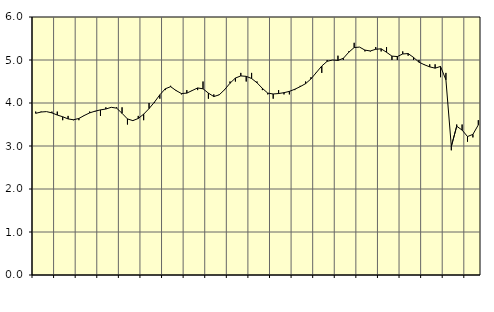
| Category | Piggar | Series 1 |
|---|---|---|
| nan | 3.8 | 3.76 |
| 1.0 | 3.8 | 3.79 |
| 1.0 | 3.8 | 3.8 |
| 1.0 | 3.8 | 3.77 |
| nan | 3.8 | 3.72 |
| 2.0 | 3.6 | 3.68 |
| 2.0 | 3.7 | 3.63 |
| 2.0 | 3.6 | 3.61 |
| nan | 3.6 | 3.64 |
| 3.0 | 3.7 | 3.71 |
| 3.0 | 3.8 | 3.77 |
| 3.0 | 3.8 | 3.81 |
| nan | 3.7 | 3.84 |
| 4.0 | 3.9 | 3.86 |
| 4.0 | 3.9 | 3.9 |
| 4.0 | 3.9 | 3.88 |
| nan | 3.9 | 3.76 |
| 5.0 | 3.5 | 3.63 |
| 5.0 | 3.6 | 3.59 |
| 5.0 | 3.7 | 3.64 |
| nan | 3.6 | 3.74 |
| 6.0 | 4 | 3.87 |
| 6.0 | 4 | 4.02 |
| 6.0 | 4.1 | 4.19 |
| nan | 4.3 | 4.33 |
| 7.0 | 4.4 | 4.38 |
| 7.0 | 4.3 | 4.29 |
| 7.0 | 4.2 | 4.22 |
| nan | 4.3 | 4.23 |
| 8.0 | 4.3 | 4.29 |
| 8.0 | 4.3 | 4.35 |
| 8.0 | 4.5 | 4.33 |
| nan | 4.1 | 4.23 |
| 9.0 | 4.2 | 4.15 |
| 9.0 | 4.2 | 4.19 |
| 9.0 | 4.3 | 4.31 |
| nan | 4.5 | 4.46 |
| 10.0 | 4.5 | 4.58 |
| 10.0 | 4.7 | 4.63 |
| 10.0 | 4.5 | 4.62 |
| nan | 4.7 | 4.57 |
| 11.0 | 4.5 | 4.47 |
| 11.0 | 4.3 | 4.34 |
| 11.0 | 4.2 | 4.23 |
| nan | 4.1 | 4.21 |
| 12.0 | 4.3 | 4.22 |
| 12.0 | 4.2 | 4.24 |
| 12.0 | 4.2 | 4.27 |
| nan | 4.3 | 4.32 |
| 13.0 | 4.4 | 4.38 |
| 13.0 | 4.5 | 4.45 |
| 13.0 | 4.6 | 4.56 |
| nan | 4.7 | 4.71 |
| 14.0 | 4.7 | 4.86 |
| 14.0 | 5 | 4.97 |
| 14.0 | 5 | 5 |
| nan | 5.1 | 4.99 |
| 15.0 | 5 | 5.04 |
| 15.0 | 5.2 | 5.18 |
| 15.0 | 5.4 | 5.29 |
| nan | 5.3 | 5.3 |
| 16.0 | 5.2 | 5.23 |
| 16.0 | 5.2 | 5.21 |
| 16.0 | 5.3 | 5.25 |
| nan | 5.2 | 5.26 |
| 17.0 | 5.3 | 5.18 |
| 17.0 | 5 | 5.09 |
| 17.0 | 5 | 5.08 |
| nan | 5.2 | 5.14 |
| 18.0 | 5.1 | 5.15 |
| 18.0 | 5 | 5.06 |
| 18.0 | 5 | 4.95 |
| nan | 4.9 | 4.89 |
| 19.0 | 4.9 | 4.84 |
| 19.0 | 4.9 | 4.81 |
| 19.0 | 4.6 | 4.85 |
| nan | 4.7 | 4.54 |
| 20.0 | 2.9 | 2.99 |
| 20.0 | 3.5 | 3.46 |
| 20.0 | 3.5 | 3.37 |
| nan | 3.1 | 3.22 |
| 21.0 | 3.2 | 3.27 |
| 21.0 | 3.6 | 3.49 |